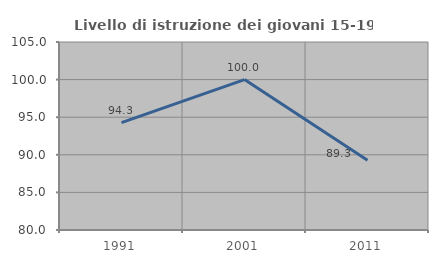
| Category | Livello di istruzione dei giovani 15-19 anni |
|---|---|
| 1991.0 | 94.286 |
| 2001.0 | 100 |
| 2011.0 | 89.286 |